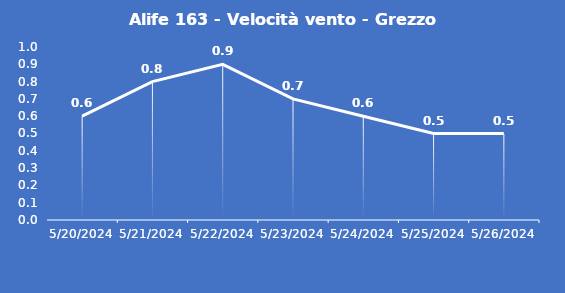
| Category | Alife 163 - Velocità vento - Grezzo (m/s) |
|---|---|
| 5/20/24 | 0.6 |
| 5/21/24 | 0.8 |
| 5/22/24 | 0.9 |
| 5/23/24 | 0.7 |
| 5/24/24 | 0.6 |
| 5/25/24 | 0.5 |
| 5/26/24 | 0.5 |